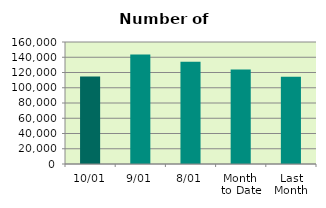
| Category | Series 0 |
|---|---|
| 10/01 | 114608 |
| 9/01 | 143644 |
| 8/01 | 134038 |
| Month 
to Date | 123895.429 |
| Last
Month | 114459.3 |